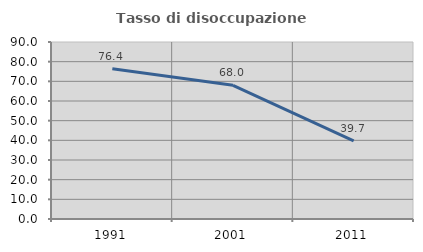
| Category | Tasso di disoccupazione giovanile  |
|---|---|
| 1991.0 | 76.421 |
| 2001.0 | 67.969 |
| 2011.0 | 39.713 |